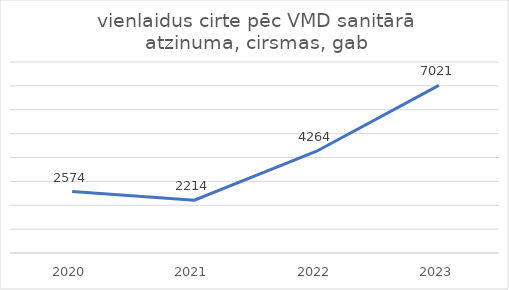
| Category | vienlaidus cirte pēc VMD sanitārā atzinuma, cirsmas, gab |
|---|---|
| 2020.0 | 2574 |
| 2021.0 | 2214 |
| 2022.0 | 4264 |
| 2023.0 | 7021 |